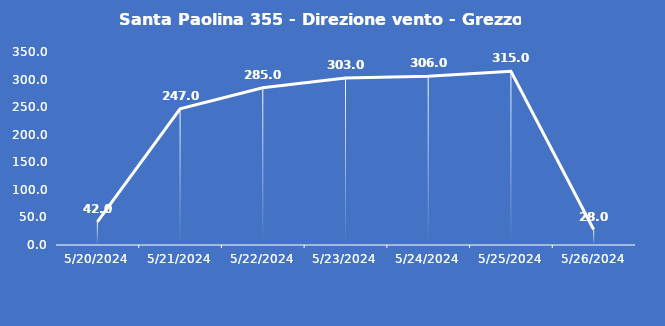
| Category | Santa Paolina 355 - Direzione vento - Grezzo (°N) |
|---|---|
| 5/20/24 | 42 |
| 5/21/24 | 247 |
| 5/22/24 | 285 |
| 5/23/24 | 303 |
| 5/24/24 | 306 |
| 5/25/24 | 315 |
| 5/26/24 | 28 |